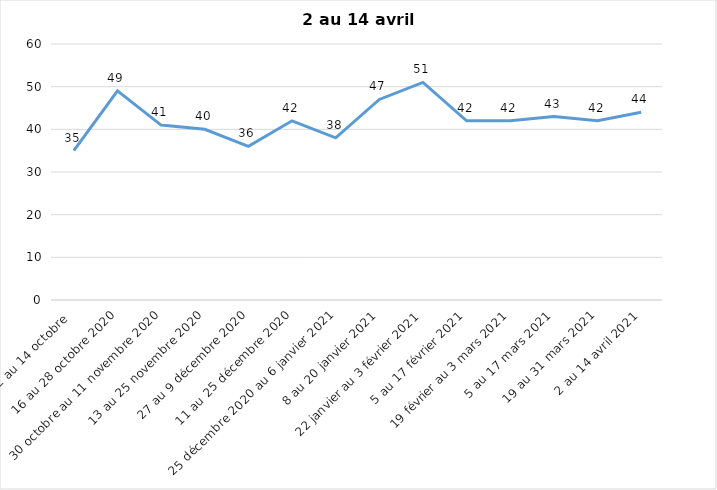
| Category | Toujours aux trois mesures |
|---|---|
| 2 au 14 octobre  | 35 |
| 16 au 28 octobre 2020 | 49 |
| 30 octobre au 11 novembre 2020 | 41 |
| 13 au 25 novembre 2020 | 40 |
| 27 au 9 décembre 2020 | 36 |
| 11 au 25 décembre 2020 | 42 |
| 25 décembre 2020 au 6 janvier 2021 | 38 |
| 8 au 20 janvier 2021 | 47 |
| 22 janvier au 3 février 2021 | 51 |
| 5 au 17 février 2021 | 42 |
| 19 février au 3 mars 2021 | 42 |
| 5 au 17 mars 2021 | 43 |
| 19 au 31 mars 2021 | 42 |
| 2 au 14 avril 2021 | 44 |